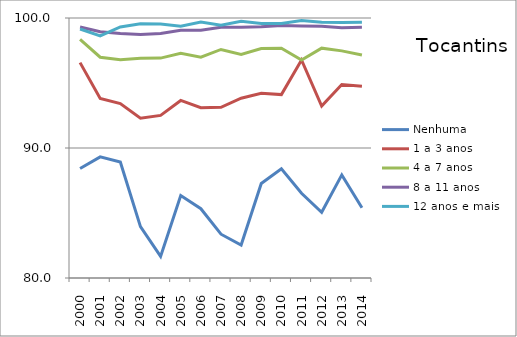
| Category | Nenhuma | 1 a 3 anos | 4 a 7 anos | 8 a 11 anos | 12 anos e mais |
|---|---|---|---|---|---|
| 2000.0 | 88.42 | 96.566 | 98.352 | 99.312 | 99.153 |
| 2001.0 | 89.316 | 93.811 | 96.982 | 98.944 | 98.619 |
| 2002.0 | 88.915 | 93.422 | 96.789 | 98.801 | 99.312 |
| 2003.0 | 83.949 | 92.287 | 96.913 | 98.729 | 99.565 |
| 2004.0 | 81.661 | 92.507 | 96.914 | 98.805 | 99.539 |
| 2005.0 | 86.339 | 93.658 | 97.285 | 99.057 | 99.371 |
| 2006.0 | 85.328 | 93.1 | 96.99 | 99.058 | 99.687 |
| 2007.0 | 83.369 | 93.128 | 97.58 | 99.287 | 99.451 |
| 2008.0 | 82.535 | 93.83 | 97.197 | 99.288 | 99.747 |
| 2009.0 | 87.267 | 94.204 | 97.648 | 99.328 | 99.58 |
| 2010.0 | 88.396 | 94.11 | 97.679 | 99.423 | 99.572 |
| 2011.0 | 86.522 | 96.772 | 96.767 | 99.388 | 99.808 |
| 2012.0 | 85.052 | 93.22 | 97.679 | 99.364 | 99.676 |
| 2013.0 | 87.931 | 94.88 | 97.472 | 99.251 | 99.645 |
| 2014.0 | 85.401 | 94.75 | 97.151 | 99.289 | 99.676 |